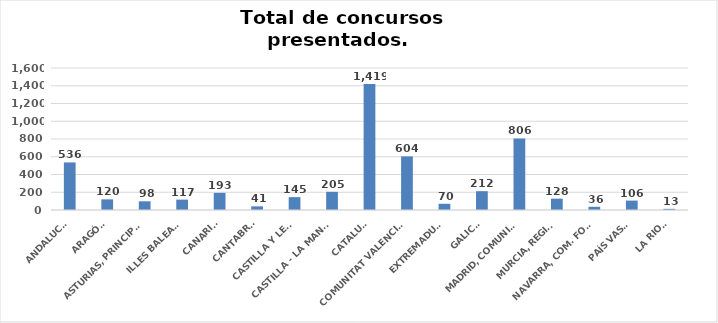
| Category | Series 0 |
|---|---|
| ANDALUCÍA | 536 |
| ARAGÓN | 120 |
| ASTURIAS, PRINCIPADO | 98 |
| ILLES BALEARS | 117 |
| CANARIAS | 193 |
| CANTABRIA | 41 |
| CASTILLA Y LEÓN | 145 |
| CASTILLA - LA MANCHA | 205 |
| CATALUÑA | 1419 |
| COMUNITAT VALENCIANA | 604 |
| EXTREMADURA | 70 |
| GALICIA | 212 |
| MADRID, COMUNIDAD | 806 |
| MURCIA, REGIÓN | 128 |
| NAVARRA, COM. FORAL | 36 |
| PAÍS VASCO | 106 |
| LA RIOJA | 13 |